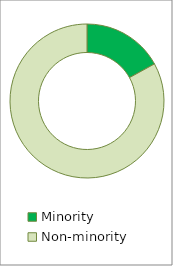
| Category | Series 0 |
|---|---|
| Minority | 0.17 |
| Non-minority | 0.83 |